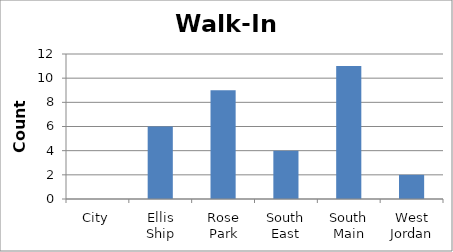
| Category | Walk-Ins |
|---|---|
| City | 0 |
| Ellis Ship | 6 |
| Rose Park | 9 |
| South East | 4 |
| South Main | 11 |
| West Jordan | 2 |